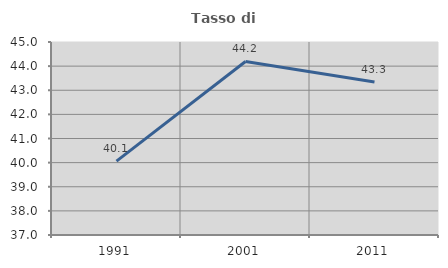
| Category | Tasso di occupazione   |
|---|---|
| 1991.0 | 40.06 |
| 2001.0 | 44.194 |
| 2011.0 | 43.345 |